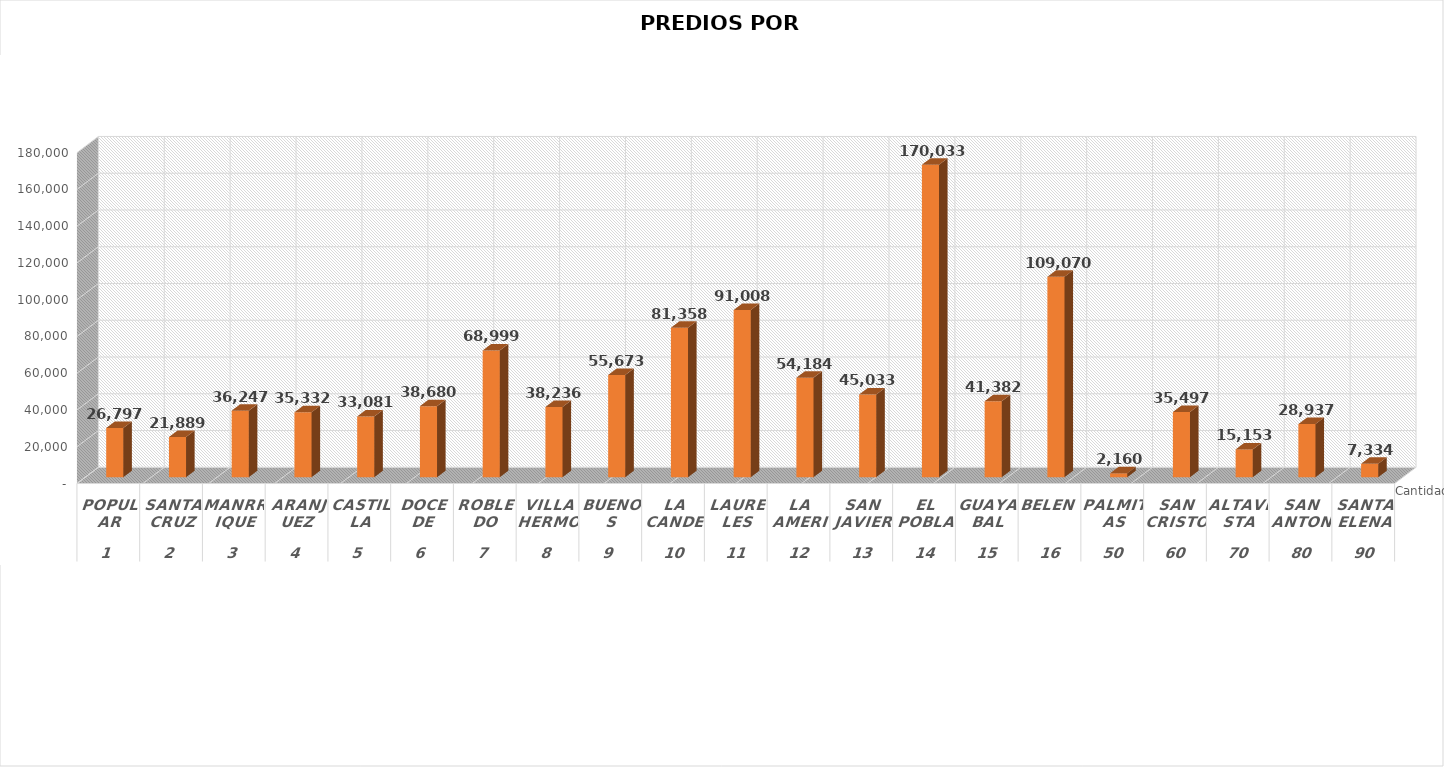
| Category | Cantidad de Predios |
|---|---|
| 0 | 26797 |
| 1 | 21889 |
| 2 | 36247 |
| 3 | 35332 |
| 4 | 33081 |
| 5 | 38680 |
| 6 | 68999 |
| 7 | 38236 |
| 8 | 55673 |
| 9 | 81358 |
| 10 | 91008 |
| 11 | 54184 |
| 12 | 45033 |
| 13 | 170033 |
| 14 | 41382 |
| 15 | 109070 |
| 16 | 2160 |
| 17 | 35497 |
| 18 | 15153 |
| 19 | 28937 |
| 20 | 7334 |